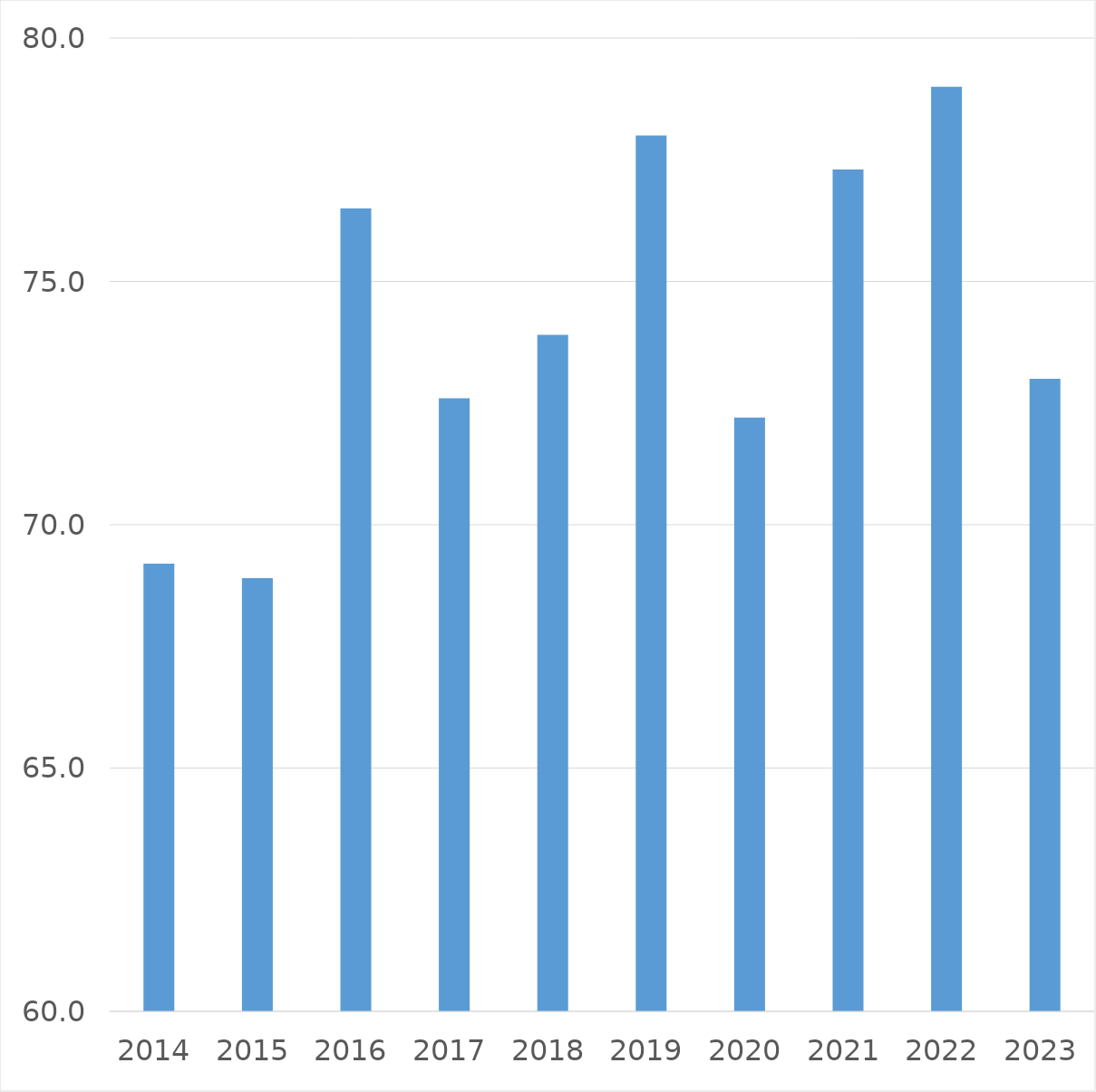
| Category | Series 0 |
|---|---|
| 2014 | 69.2 |
| 2015 | 68.9 |
| 2016 | 76.5 |
| 2017 | 72.6 |
| 2018 | 73.9 |
| 2019 | 78 |
| 2020 | 72.2 |
| 2021 | 77.3 |
| 2022 | 79 |
| 2023 | 73 |